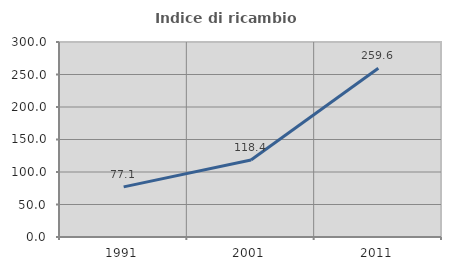
| Category | Indice di ricambio occupazionale  |
|---|---|
| 1991.0 | 77.112 |
| 2001.0 | 118.406 |
| 2011.0 | 259.563 |